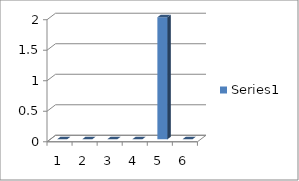
| Category | Series 0 |
|---|---|
| 0 | 0 |
| 1 | 0 |
| 2 | 0 |
| 3 | 0 |
| 4 | 2 |
| 5 | 0 |